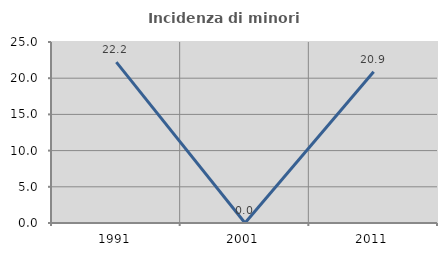
| Category | Incidenza di minori stranieri |
|---|---|
| 1991.0 | 22.222 |
| 2001.0 | 0 |
| 2011.0 | 20.896 |